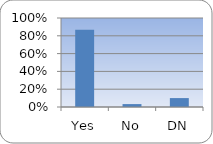
| Category | Series 0 |
|---|---|
| Yes | 0.867 |
| No | 0.033 |
| DN | 0.1 |